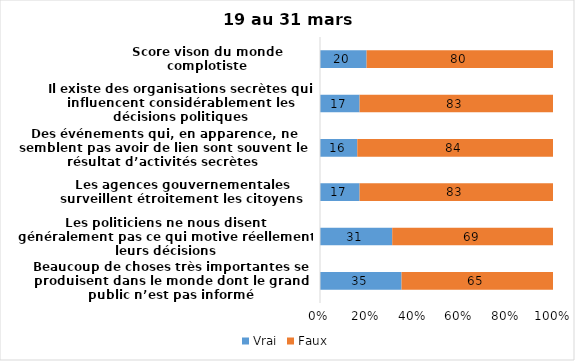
| Category | Vrai | Faux |
|---|---|---|
| Beaucoup de choses très importantes se produisent dans le monde dont le grand public n’est pas informé | 35 | 65 |
| Les politiciens ne nous disent généralement pas ce qui motive réellement leurs décisions | 31 | 69 |
| Les agences gouvernementales surveillent étroitement les citoyens | 17 | 83 |
| Des événements qui, en apparence, ne semblent pas avoir de lien sont souvent le résultat d’activités secrètes | 16 | 84 |
| Il existe des organisations secrètes qui influencent considérablement les décisions politiques | 17 | 83 |
| Score vison du monde complotiste | 20 | 80 |